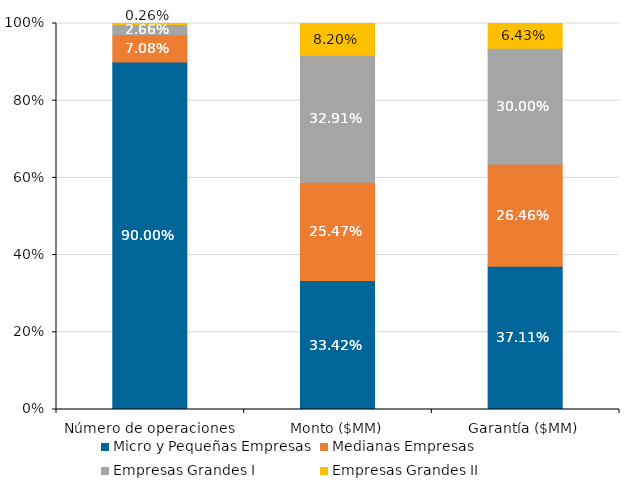
| Category | Micro y Pequeñas Empresas | Medianas Empresas | Empresas Grandes I | Empresas Grandes II |
|---|---|---|---|---|
| Número de operaciones | 0.9 | 0.071 | 0.027 | 0.003 |
| Monto ($MM) | 0.334 | 0.255 | 0.329 | 0.082 |
| Garantía ($MM) | 0.371 | 0.265 | 0.3 | 0.064 |